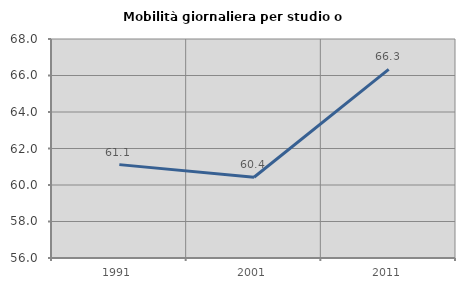
| Category | Mobilità giornaliera per studio o lavoro |
|---|---|
| 1991.0 | 61.116 |
| 2001.0 | 60.424 |
| 2011.0 | 66.339 |